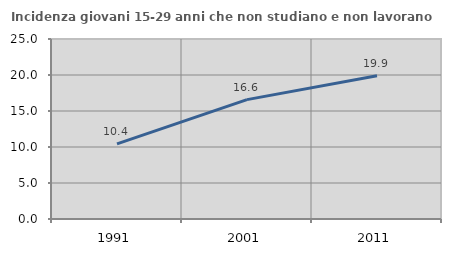
| Category | Incidenza giovani 15-29 anni che non studiano e non lavorano  |
|---|---|
| 1991.0 | 10.431 |
| 2001.0 | 16.583 |
| 2011.0 | 19.9 |